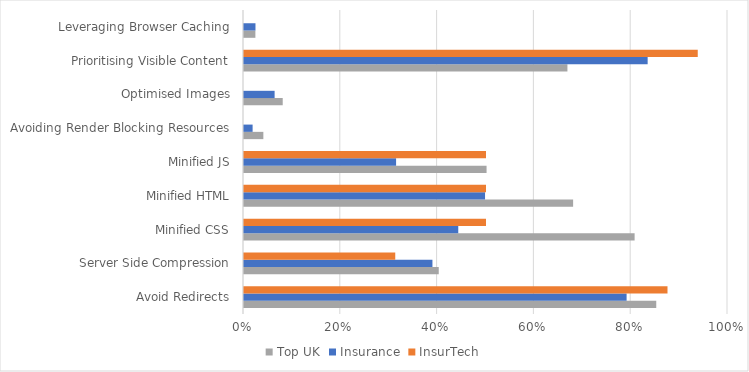
| Category | Top UK | Insurance | InsurTech |
|---|---|---|---|
| Avoid Redirects | 0.852 | 0.791 | 0.875 |
| Server Side Compression | 0.402 | 0.389 | 0.312 |
| Minified CSS | 0.807 | 0.443 | 0.5 |
| Minified HTML | 0.68 | 0.498 | 0.5 |
| Minified JS | 0.501 | 0.314 | 0.5 |
| Avoiding Render Blocking Resources | 0.04 | 0.018 | 0 |
| Optimised Images | 0.08 | 0.063 | 0 |
| Prioritising Visible Content | 0.668 | 0.834 | 0.938 |
| Leveraging Browser Caching | 0.024 | 0.024 | 0 |